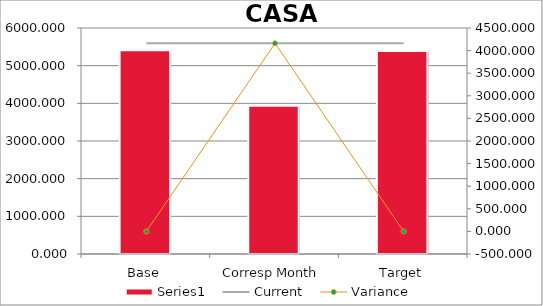
| Category | Series 0 |
|---|---|
| Base | 5407.551 |
| Corresp Month | 3934.188 |
| Target | 5387.456 |